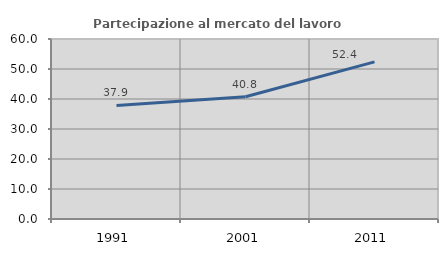
| Category | Partecipazione al mercato del lavoro  femminile |
|---|---|
| 1991.0 | 37.859 |
| 2001.0 | 40.773 |
| 2011.0 | 52.375 |